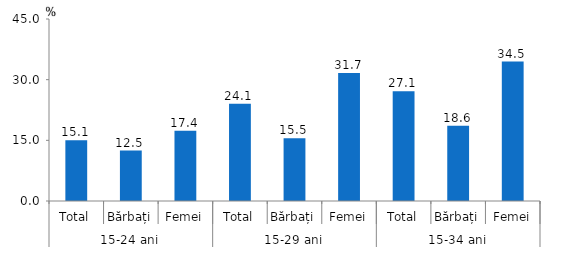
| Category | Series 0 |
|---|---|
| 0 | 15.051 |
| 1 | 12.471 |
| 2 | 17.384 |
| 3 | 24.074 |
| 4 | 15.537 |
| 5 | 31.654 |
| 6 | 27.142 |
| 7 | 18.622 |
| 8 | 34.476 |